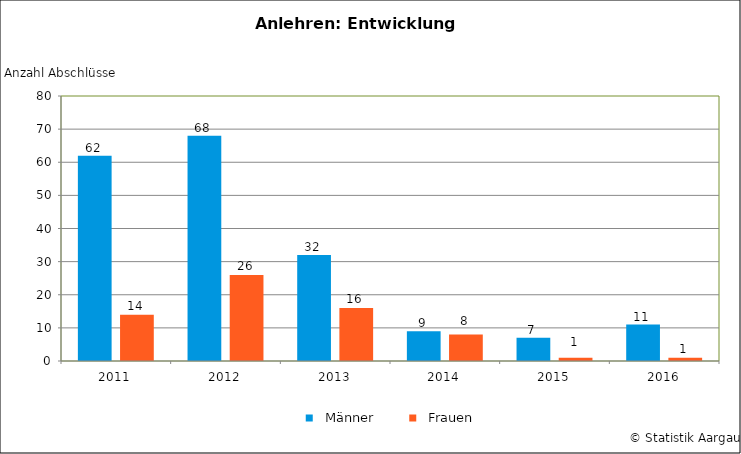
| Category |   Männer |   Frauen |
|---|---|---|
| 2011.0 | 62 | 14 |
| 2012.0 | 68 | 26 |
| 2013.0 | 32 | 16 |
| 2014.0 | 9 | 8 |
| 2015.0 | 7 | 1 |
| 2016.0 | 11 | 1 |